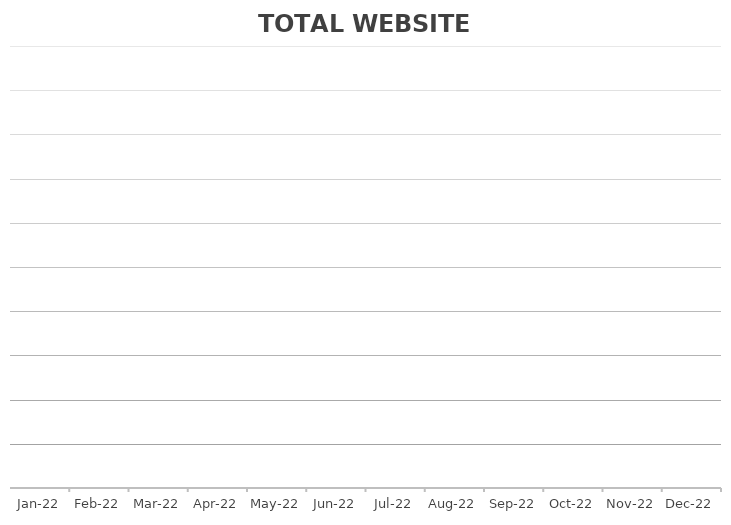
| Category | TOTAL |
|---|---|
| 2022-01-18 | 0 |
| 2022-02-18 | 0 |
| 2022-03-18 | 0 |
| 2022-04-18 | 0 |
| 2022-05-18 | 0 |
| 2022-06-18 | 0 |
| 2022-07-18 | 0 |
| 2022-08-18 | 0 |
| 2022-09-18 | 0 |
| 2022-10-18 | 0 |
| 2022-11-18 | 0 |
| 2022-12-18 | 0 |